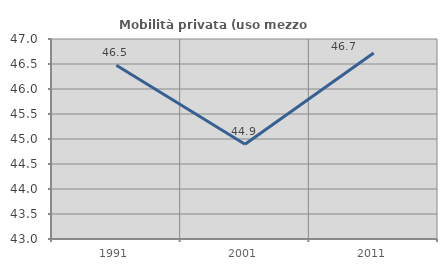
| Category | Mobilità privata (uso mezzo privato) |
|---|---|
| 1991.0 | 46.476 |
| 2001.0 | 44.894 |
| 2011.0 | 46.72 |